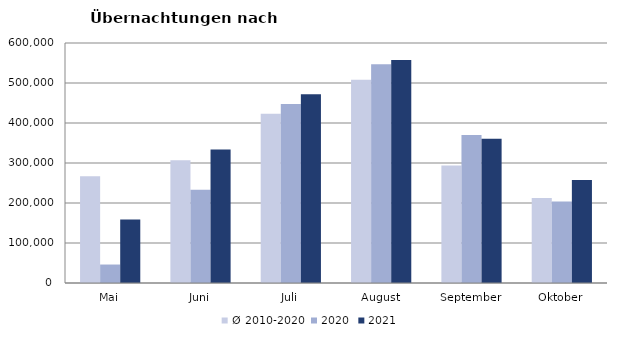
| Category | Ø 2010-2020 | 2020 | 2021 |
|---|---|---|---|
| Mai | 267078.182 | 46179 | 158476 |
| Juni | 307010.273 | 233437 | 333648 |
| Juli | 423318.455 | 447640 | 472159 |
| August | 508075.364 | 546671 | 557336 |
| September | 293791.364 | 369853 | 360851 |
| Oktober | 212194 | 203553 | 257726 |